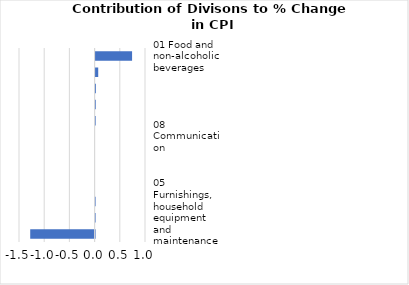
| Category |     Contributions |
|---|---|
| 01 Food and non-alcoholic beverages | 0.724 |
| 07 Transport | 0.052 |
| 11 Restaurants and hotels | 0.006 |
| 03 Clothing and footwear | 0.003 |
| 12 Miscellaneous goods and services | 0.001 |
| 08 Communication | 0 |
| 09 Recreation and culture | 0 |
| 06 Health | 0 |
| 10 Education | 0 |
| 02 Alcoholic beverages, tobacco and narcotics | -0.003 |
| 05 Furnishings, household equipment and maintenance | -0.006 |
| 04 Housing, water, electricity, gas and other fuels | -1.277 |